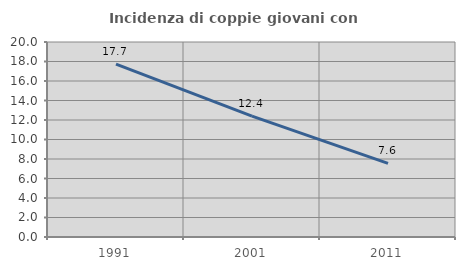
| Category | Incidenza di coppie giovani con figli |
|---|---|
| 1991.0 | 17.734 |
| 2001.0 | 12.405 |
| 2011.0 | 7.557 |